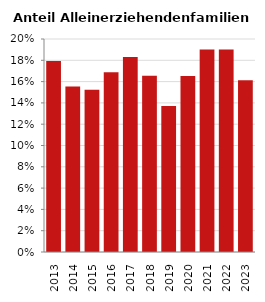
| Category | Anteil Alleinerziehende an Familien |
|---|---|
| 2013.0 | 0.179 |
| 2014.0 | 0.155 |
| 2015.0 | 0.152 |
| 2016.0 | 0.169 |
| 2017.0 | 0.183 |
| 2018.0 | 0.165 |
| 2019.0 | 0.137 |
| 2020.0 | 0.165 |
| 2021.0 | 0.19 |
| 2022.0 | 0.19 |
| 2023.0 | 0.161 |